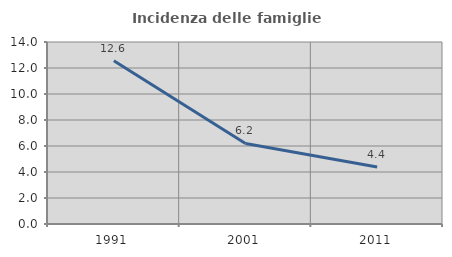
| Category | Incidenza delle famiglie numerose |
|---|---|
| 1991.0 | 12.56 |
| 2001.0 | 6.194 |
| 2011.0 | 4.381 |